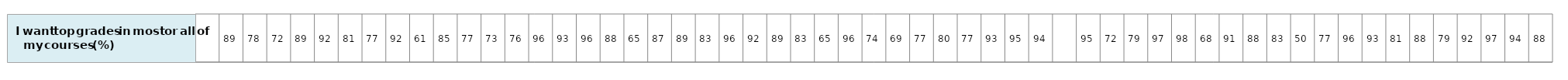
| Category | I want top grades in most or all of my courses |
|---|---|
| nan | 1 |
| 89.20132428 | 1 |
| 77.9337702 | 1 |
| 72.06471985 | 1 |
| 88.69965274 | 1 |
| 92.22064831 | 1 |
| 81.08930704 | 1 |
| 76.94375955999999 | 1 |
| 92.03503438999999 | 1 |
| 60.59881294 | 1 |
| 85.24401262 | 1 |
| 76.54741433 | 1 |
| 72.88021472999999 | 1 |
| 76.29257783 | 1 |
| 96.17846295999999 | 1 |
| 92.69342906 | 1 |
| 96.02768761 | 1 |
| 88.03410653 | 1 |
| 64.81575205 | 1 |
| 86.65608176 | 1 |
| 88.52951691999999 | 1 |
| 82.62494233999999 | 1 |
| 96.35099073 | 1 |
| 91.996696 | 1 |
| 88.7573364 | 1 |
| 83.44043259 | 1 |
| 64.87317034 | 1 |
| 95.68975782999999 | 1 |
| 73.53844265000001 | 1 |
| 69.45275896999999 | 1 |
| 77.12930485999999 | 1 |
| 79.99245275999999 | 1 |
| 77.30249569 | 1 |
| 93.45101738 | 1 |
| 95.40773309 | 1 |
| 94.31093446 | 1 |
| nan | 1 |
| 95.06222277 | 1 |
| 72.38638795 | 1 |
| 78.54024928999999 | 1 |
| 96.64406788 | 1 |
| 97.70564633 | 1 |
| 68.40203502 | 1 |
| 91.13666151999999 | 1 |
| 88.12597318 | 1 |
| 83.11124766 | 1 |
| 49.75760539 | 1 |
| 76.7988691 | 1 |
| 96.49538229000001 | 1 |
| 93.43310672999999 | 1 |
| 80.86091436 | 1 |
| 88.12412262000001 | 1 |
| 79.40381260999999 | 1 |
| 91.51912913000001 | 1 |
| 96.50225462 | 1 |
| 93.60266738 | 1 |
| 88.48657266000001 | 1 |